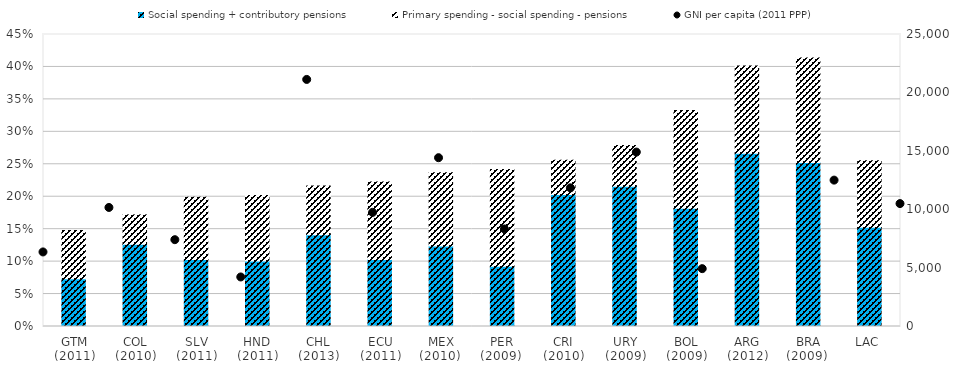
| Category | Social spending + contributory pensions | Primary spending - social spending - pensions |
|---|---|---|
| GTM
(2011) | 0.074 | 0.074 |
| COL
(2010) | 0.127 | 0.045 |
| SLV
(2011) | 0.103 | 0.096 |
| HND
(2011) | 0.101 | 0.101 |
| CHL
(2013) | 0.141 | 0.075 |
| ECU
(2011) | 0.103 | 0.119 |
| MEX
(2010)  | 0.124 | 0.113 |
| PER
(2009)  | 0.093 | 0.149 |
| CRI
(2010) | 0.203 | 0.053 |
| URY
(2009) | 0.216 | 0.063 |
| BOL
(2009) | 0.182 | 0.151 |
| ARG
(2012) | 0.267 | 0.134 |
| BRA
(2009)  | 0.253 | 0.161 |
| LAC | 0.153 | 0.103 |